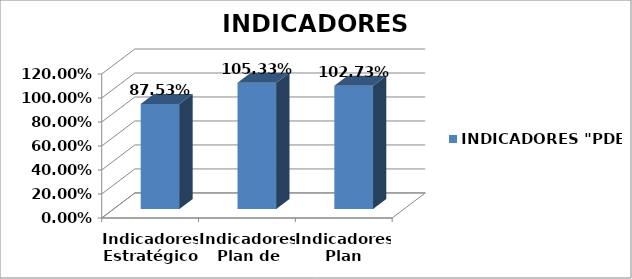
| Category | INDICADORES "PDE" |
|---|---|
| Indicadores Estratégicos | 0.875 |
| Indicadores Plan de Acción | 1.053 |
| Indicadores Plan Indicativo | 1.027 |